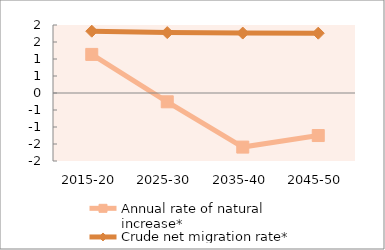
| Category | Annual rate of natural increase* | Crude net migration rate* |
|---|---|---|
| 2015-20 | 1.135 | 1.818 |
| 2025-30 | -0.259 | 1.777 |
| 2035-40 | -1.591 | 1.763 |
| 2045-50 | -1.251 | 1.759 |